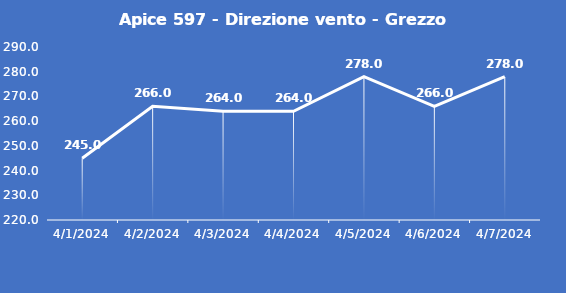
| Category | Apice 597 - Direzione vento - Grezzo (°N) |
|---|---|
| 4/1/24 | 245 |
| 4/2/24 | 266 |
| 4/3/24 | 264 |
| 4/4/24 | 264 |
| 4/5/24 | 278 |
| 4/6/24 | 266 |
| 4/7/24 | 278 |